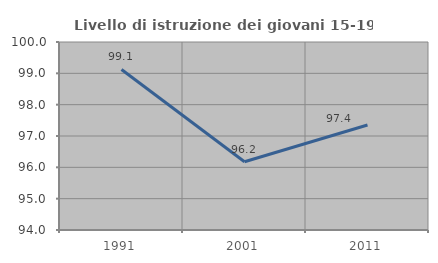
| Category | Livello di istruzione dei giovani 15-19 anni |
|---|---|
| 1991.0 | 99.123 |
| 2001.0 | 96.178 |
| 2011.0 | 97.351 |